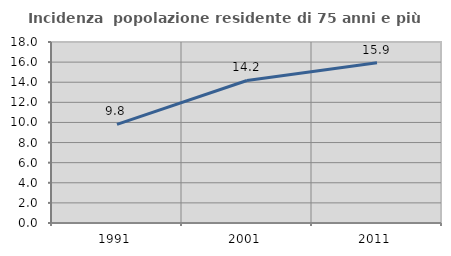
| Category | Incidenza  popolazione residente di 75 anni e più |
|---|---|
| 1991.0 | 9.804 |
| 2001.0 | 14.173 |
| 2011.0 | 15.929 |